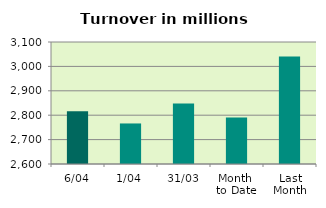
| Category | Series 0 |
|---|---|
| 6/04 | 2815.987 |
| 1/04 | 2766.154 |
| 31/03 | 2847.786 |
| Month 
to Date | 2791.071 |
| Last
Month | 3040.277 |